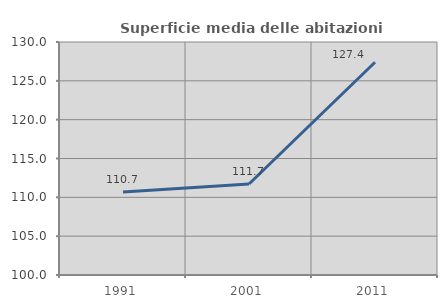
| Category | Superficie media delle abitazioni occupate |
|---|---|
| 1991.0 | 110.677 |
| 2001.0 | 111.716 |
| 2011.0 | 127.391 |